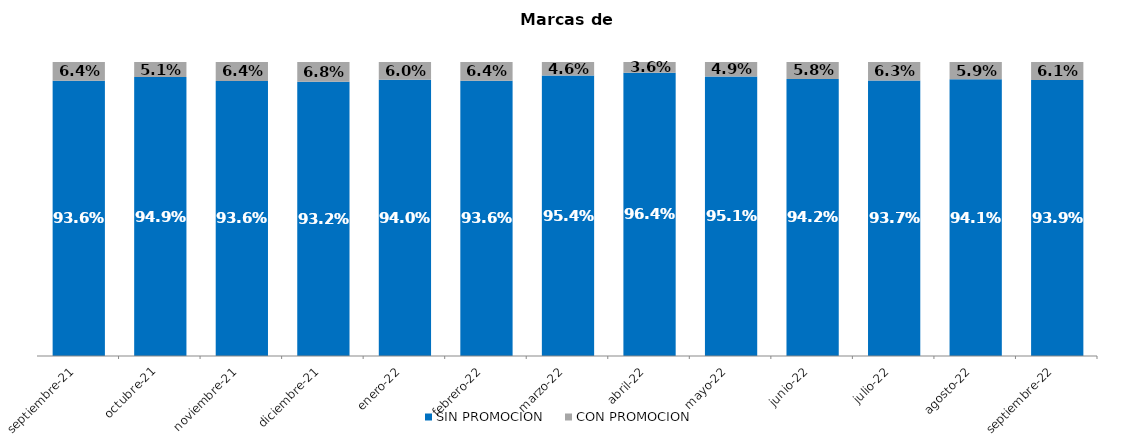
| Category | SIN PROMOCION   | CON PROMOCION   |
|---|---|---|
| 2021-09-01 | 0.936 | 0.064 |
| 2021-10-01 | 0.949 | 0.051 |
| 2021-11-01 | 0.936 | 0.064 |
| 2021-12-01 | 0.932 | 0.068 |
| 2022-01-01 | 0.94 | 0.06 |
| 2022-02-01 | 0.936 | 0.064 |
| 2022-03-01 | 0.954 | 0.046 |
| 2022-04-01 | 0.964 | 0.036 |
| 2022-05-01 | 0.951 | 0.049 |
| 2022-06-01 | 0.942 | 0.058 |
| 2022-07-01 | 0.937 | 0.063 |
| 2022-08-01 | 0.941 | 0.059 |
| 2022-09-01 | 0.939 | 0.061 |